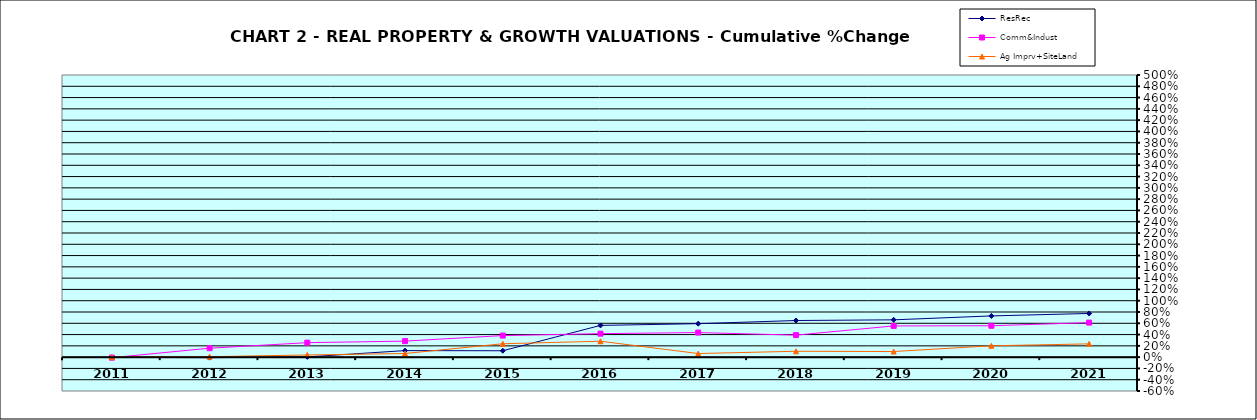
| Category | ResRec | Comm&Indust | Ag Imprv+SiteLand |
|---|---|---|---|
| 2011.0 | -0.003 | -0.009 | 0 |
| 2012.0 | -0.009 | 0.159 | 0.008 |
| 2013.0 | 0.004 | 0.257 | 0.038 |
| 2014.0 | 0.116 | 0.284 | 0.064 |
| 2015.0 | 0.113 | 0.382 | 0.237 |
| 2016.0 | 0.562 | 0.416 | 0.282 |
| 2017.0 | 0.593 | 0.435 | 0.064 |
| 2018.0 | 0.649 | 0.39 | 0.104 |
| 2019.0 | 0.661 | 0.553 | 0.1 |
| 2020.0 | 0.731 | 0.556 | 0.201 |
| 2021.0 | 0.774 | 0.612 | 0.235 |